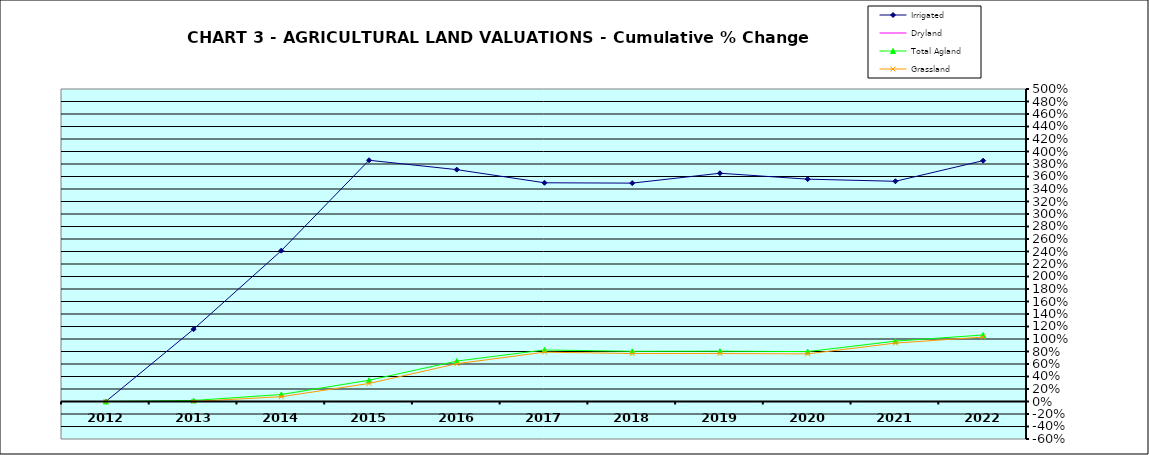
| Category | Irrigated | Dryland | Total Agland | Grassland |
|---|---|---|---|---|
| 2012.0 | 0 | 0 | 0 | 0 |
| 2013.0 | 1.157 | 0 | 0.017 | 0.001 |
| 2014.0 | 2.413 | 0 | 0.112 | 0.077 |
| 2015.0 | 3.86 | 0 | 0.34 | 0.288 |
| 2016.0 | 3.71 | 0 | 0.647 | 0.604 |
| 2017.0 | 3.5 | 0 | 0.825 | 0.79 |
| 2018.0 | 3.494 | 0 | 0.803 | 0.768 |
| 2019.0 | 3.652 | 0 | 0.805 | 0.767 |
| 2020.0 | 3.558 | 0 | 0.799 | 0.762 |
| 2021.0 | 3.523 | 0 | 0.966 | 0.935 |
| 2022.0 | 3.854 | 0 | 1.064 | 1.031 |